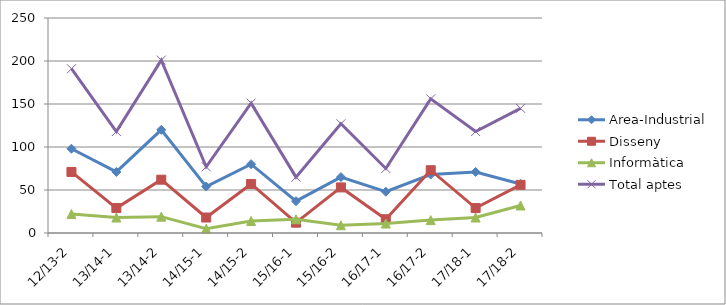
| Category | Area-Industrial | Disseny | Informàtica | Total aptes |
|---|---|---|---|---|
| 12/13-2 | 98 | 71 | 22 | 191 |
| 13/14-1 | 71 | 29 | 18 | 118 |
| 13/14-2 | 120 | 62 | 19 | 201 |
| 14/15-1 | 54 | 18 | 5 | 77 |
| 14/15-2 | 80 | 57 | 14 | 151 |
| 15/16-1 | 37 | 12 | 16 | 65 |
| 15/16-2 | 65 | 53 | 9 | 127 |
| 16/17-1 | 48 | 16 | 11 | 75 |
| 16/17-2 | 68 | 73 | 15 | 156 |
| 17/18-1 | 71 | 29 | 18 | 118 |
| 17/18-2 | 57 | 56 | 32 | 145 |